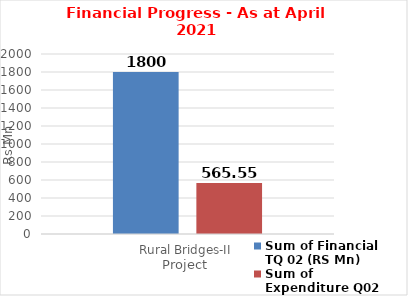
| Category | Sum of Financial TQ 02 (RS Mn) | Sum of Expenditure Q02 (RS Mn)  |
|---|---|---|
| Rural Bridges-II | 1800 | 565.55 |